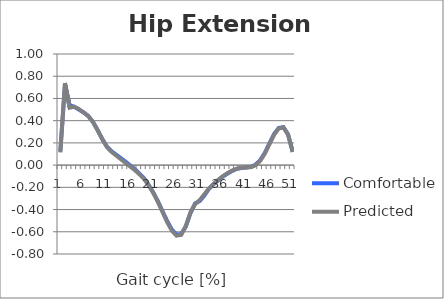
| Category | Comfortable | Predicted |
|---|---|---|
| 0 | 0.123 | 0.115 |
| 1 | 0.725 | 0.739 |
| 2 | 0.538 | 0.516 |
| 3 | 0.525 | 0.526 |
| 4 | 0.5 | 0.504 |
| 5 | 0.475 | 0.473 |
| 6 | 0.443 | 0.44 |
| 7 | 0.39 | 0.391 |
| 8 | 0.317 | 0.315 |
| 9 | 0.237 | 0.235 |
| 10 | 0.167 | 0.165 |
| 11 | 0.125 | 0.12 |
| 12 | 0.095 | 0.087 |
| 13 | 0.064 | 0.054 |
| 14 | 0.032 | 0.021 |
| 15 | -0.001 | -0.012 |
| 16 | -0.035 | -0.044 |
| 17 | -0.076 | -0.082 |
| 18 | -0.116 | -0.124 |
| 19 | -0.178 | -0.182 |
| 20 | -0.246 | -0.251 |
| 21 | -0.326 | -0.331 |
| 22 | -0.416 | -0.422 |
| 23 | -0.504 | -0.513 |
| 24 | -0.58 | -0.59 |
| 25 | -0.625 | -0.635 |
| 26 | -0.622 | -0.628 |
| 27 | -0.554 | -0.547 |
| 28 | -0.432 | -0.425 |
| 29 | -0.345 | -0.351 |
| 30 | -0.323 | -0.315 |
| 31 | -0.273 | -0.262 |
| 32 | -0.212 | -0.21 |
| 33 | -0.171 | -0.168 |
| 34 | -0.135 | -0.132 |
| 35 | -0.103 | -0.099 |
| 36 | -0.076 | -0.071 |
| 37 | -0.052 | -0.048 |
| 38 | -0.033 | -0.032 |
| 39 | -0.026 | -0.025 |
| 40 | -0.021 | -0.022 |
| 41 | -0.016 | -0.018 |
| 42 | 0.003 | -0.002 |
| 43 | 0.044 | 0.037 |
| 44 | 0.11 | 0.103 |
| 45 | 0.196 | 0.188 |
| 46 | 0.28 | 0.273 |
| 47 | 0.335 | 0.33 |
| 48 | 0.341 | 0.339 |
| 49 | 0.278 | 0.274 |
| 50 | 0.12 | 0.118 |